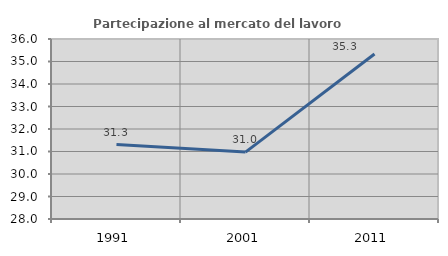
| Category | Partecipazione al mercato del lavoro  femminile |
|---|---|
| 1991.0 | 31.306 |
| 2001.0 | 30.973 |
| 2011.0 | 35.334 |